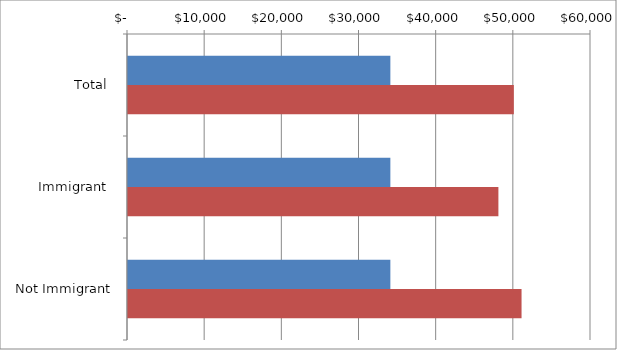
| Category | Series 0 | Series 1 |
|---|---|---|
| Total | 34000 | 50000 |
|  Immigrant  | 34000 | 48000 |
|  Not Immigrant  | 34000 | 51000 |